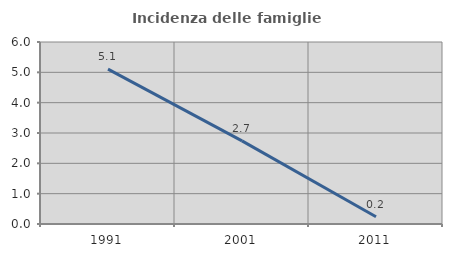
| Category | Incidenza delle famiglie numerose |
|---|---|
| 1991.0 | 5.105 |
| 2001.0 | 2.74 |
| 2011.0 | 0.24 |